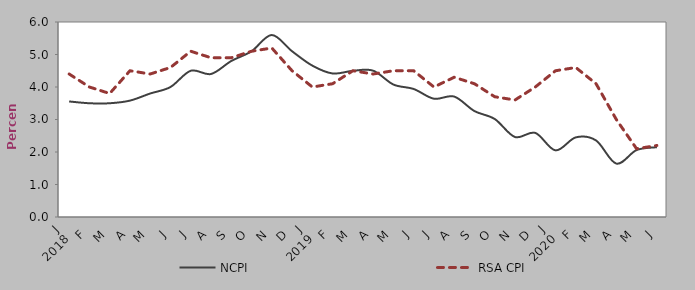
| Category | NCPI | RSA CPI |
|---|---|---|
| 0 | 3.555 | 4.4 |
| 1900-01-01 | 3.5 | 4 |
| 1900-01-02 | 3.5 | 3.8 |
| 1900-01-03 | 3.581 | 4.5 |
| 1900-01-04 | 3.8 | 4.4 |
| 1900-01-05 | 4 | 4.6 |
| 1900-01-06 | 4.5 | 5.1 |
| 1900-01-07 | 4.4 | 4.9 |
| 1900-01-08 | 4.8 | 4.9 |
| 1900-01-09 | 5.1 | 5.1 |
| 1900-01-10 | 5.6 | 5.2 |
| 1900-01-11 | 5.1 | 4.5 |
| 1900-01-12 | 4.658 | 4 |
| 1900-01-13 | 4.416 | 4.1 |
| 1900-01-14 | 4.498 | 4.5 |
| 1900-01-15 | 4.503 | 4.4 |
| 1900-01-16 | 4.076 | 4.5 |
| 1900-01-17 | 3.939 | 4.5 |
| 1900-01-18 | 3.639 | 4 |
| 1900-01-19 | 3.705 | 4.3 |
| 1900-01-20 | 3.259 | 4.1 |
| 1900-01-21 | 3.015 | 3.7 |
| 1900-01-22 | 2.461 | 3.6 |
| 1900-01-23 | 2.588 | 4 |
| 1900-01-24 | 2.05 | 4.5 |
| 1900-01-25 | 2.45 | 4.6 |
| 1900-01-26 | 2.354 | 4.1 |
| 1900-01-27 | 1.643 | 3 |
| 1900-01-28 | 2.06 | 2.1 |
| 1900-01-29 | 2.147 | 2.2 |